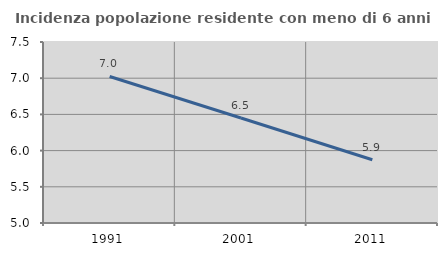
| Category | Incidenza popolazione residente con meno di 6 anni |
|---|---|
| 1991.0 | 7.024 |
| 2001.0 | 6.451 |
| 2011.0 | 5.874 |